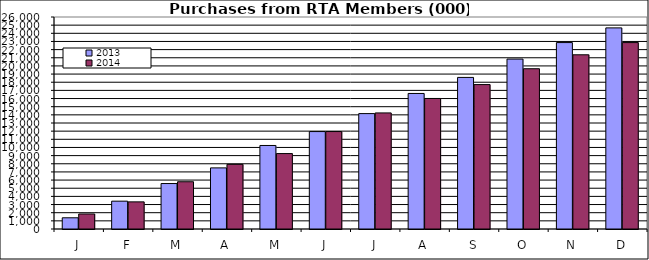
| Category | 2013 | 2014 |
|---|---|---|
| J | 1375.298 | 1842.078 |
| F | 3413.689 | 3327.055 |
| M | 5575.07 | 5794.828 |
| A | 7495.041 | 7931.408 |
| M | 10243.35 | 9251.089 |
| J | 11948.593 | 11950.353 |
| J | 14152.083 | 14236.49 |
| A | 16623.363 | 16009.635 |
| S | 18591.626 | 17711.483 |
| O | 20839.683 | 19656.258 |
| N | 22864.461 | 21366.276 |
| D | 24664.451 | 22861.557 |